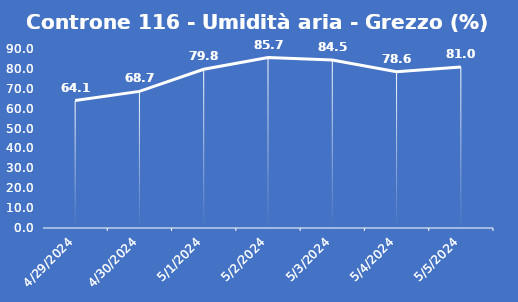
| Category | Controne 116 - Umidità aria - Grezzo (%) |
|---|---|
| 4/29/24 | 64.1 |
| 4/30/24 | 68.7 |
| 5/1/24 | 79.8 |
| 5/2/24 | 85.7 |
| 5/3/24 | 84.5 |
| 5/4/24 | 78.6 |
| 5/5/24 | 81 |